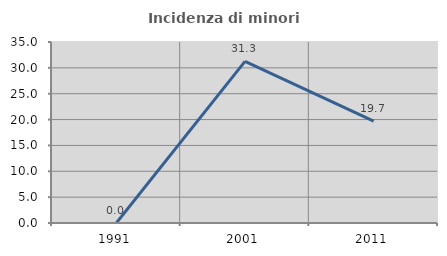
| Category | Incidenza di minori stranieri |
|---|---|
| 1991.0 | 0 |
| 2001.0 | 31.25 |
| 2011.0 | 19.697 |